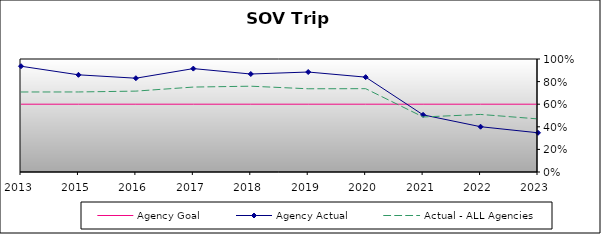
| Category | Agency Goal | Agency Actual | Actual - ALL Agencies |
|---|---|---|---|
| 2013.0 | 0.6 | 0.936 | 0.708 |
| 2015.0 | 0.6 | 0.86 | 0.708 |
| 2016.0 | 0.6 | 0.83 | 0.716 |
| 2017.0 | 0.6 | 0.915 | 0.752 |
| 2018.0 | 0.6 | 0.867 | 0.759 |
| 2019.0 | 0.6 | 0.885 | 0.736 |
| 2020.0 | 0.6 | 0.839 | 0.737 |
| 2021.0 | 0.6 | 0.506 | 0.487 |
| 2022.0 | 0.6 | 0.401 | 0.509 |
| 2023.0 | 0.6 | 0.347 | 0.47 |